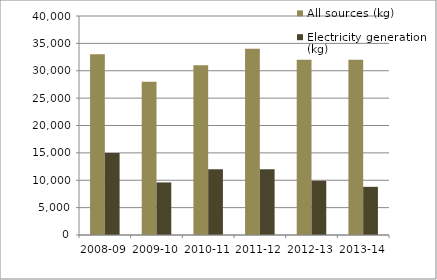
| Category | All sources (kg) | Electricity generation (kg) |
|---|---|---|
| 2008-09 | 33000 | 15000 |
| 2009-10 | 28000 | 9600 |
| 2010-11 | 31000 | 12000 |
| 2011-12 | 34000 | 12000 |
| 2012-13 | 32000 | 9900 |
| 2013-14 | 32000 | 8800 |